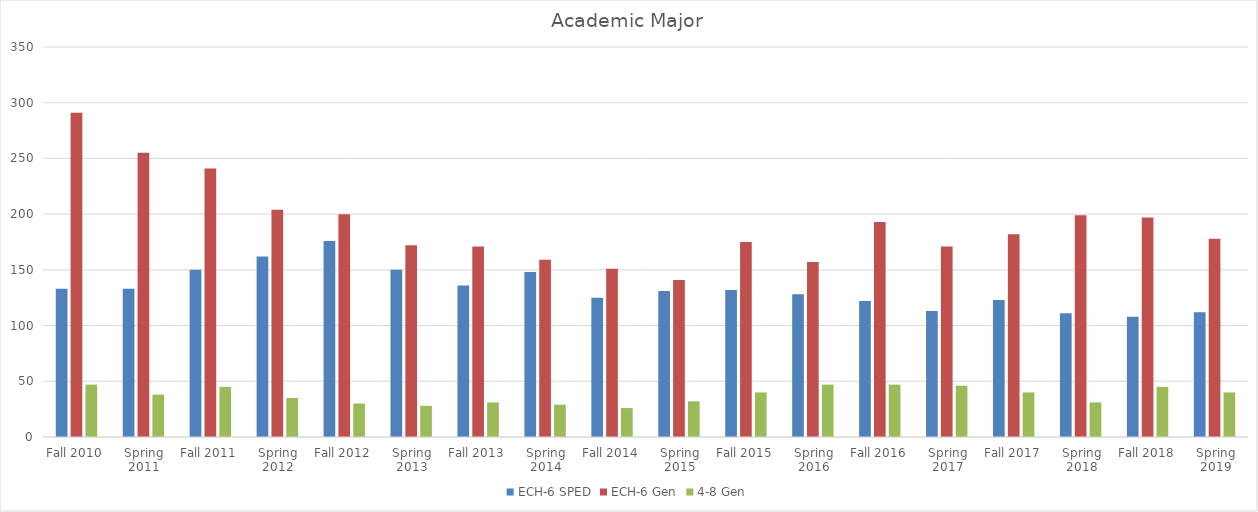
| Category | ECH-6 SPED | ECH-6 Gen | 4-8 Gen |
|---|---|---|---|
| Fall 2010 | 133 | 291 | 47 |
| Spring 2011 | 133 | 255 | 38 |
| Fall 2011 | 150 | 241 | 45 |
| Spring 2012 | 162 | 204 | 35 |
| Fall 2012 | 176 | 200 | 30 |
| Spring 2013 | 150 | 172 | 28 |
| Fall 2013 | 136 | 171 | 31 |
| Spring 2014 | 148 | 159 | 29 |
| Fall 2014 | 125 | 151 | 26 |
| Spring 2015 | 131 | 141 | 32 |
| Fall 2015 | 132 | 175 | 40 |
| Spring 2016 | 128 | 157 | 47 |
| Fall 2016 | 122 | 193 | 47 |
| Spring 2017 | 113 | 171 | 46 |
| Fall 2017 | 123 | 182 | 40 |
| Spring 2018 | 111 | 199 | 31 |
| Fall 2018 | 108 | 197 | 45 |
| Spring 2019 | 112 | 178 | 40 |